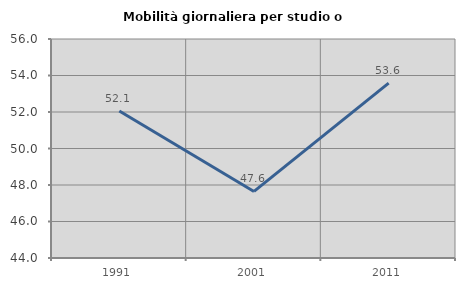
| Category | Mobilità giornaliera per studio o lavoro |
|---|---|
| 1991.0 | 52.053 |
| 2001.0 | 47.649 |
| 2011.0 | 53.58 |